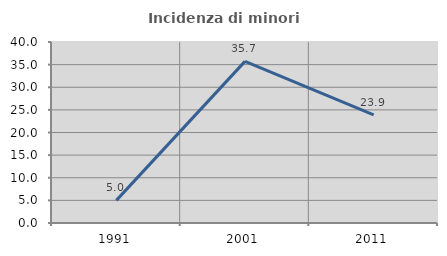
| Category | Incidenza di minori stranieri |
|---|---|
| 1991.0 | 5 |
| 2001.0 | 35.714 |
| 2011.0 | 23.871 |